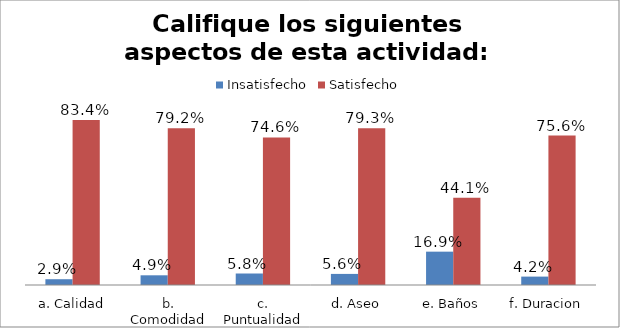
| Category | Insatisfecho | Satisfecho |
|---|---|---|
| a. Calidad | 0.029 | 0.834 |
| b. Comodidad | 0.049 | 0.792 |
| c. Puntualidad | 0.058 | 0.746 |
| d. Aseo | 0.056 | 0.793 |
| e. Baños | 0.169 | 0.441 |
| f. Duracion | 0.042 | 0.756 |